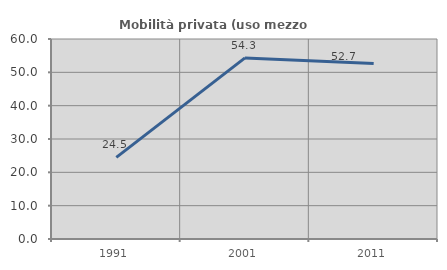
| Category | Mobilità privata (uso mezzo privato) |
|---|---|
| 1991.0 | 24.505 |
| 2001.0 | 54.335 |
| 2011.0 | 52.667 |